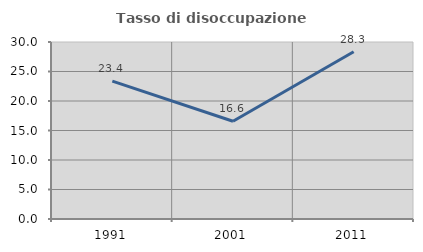
| Category | Tasso di disoccupazione giovanile  |
|---|---|
| 1991.0 | 23.368 |
| 2001.0 | 16.564 |
| 2011.0 | 28.346 |